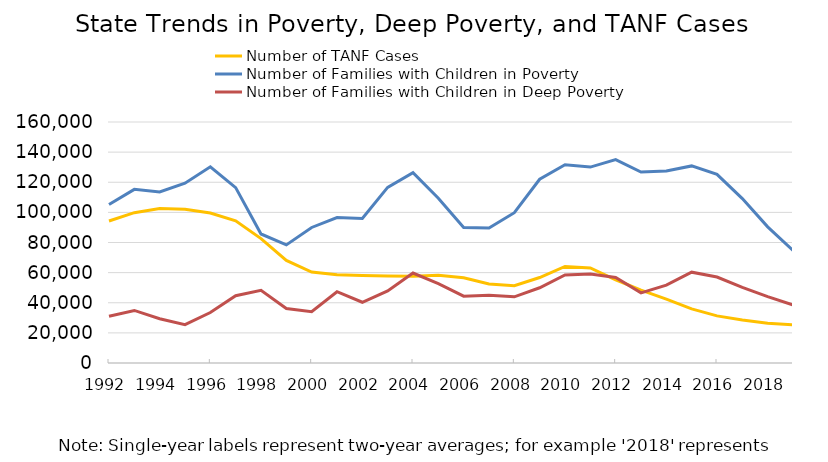
| Category | Number of TANF Cases | Number of Families with Children in Poverty | Number of Families with Children in Deep Poverty |
|---|---|---|---|
| 1992.0 | 94277.833 | 105231.5 | 31009.5 |
| 1993.0 | 99813.417 | 115269 | 34899.5 |
| 1994.0 | 102578.208 | 113508.5 | 29349.5 |
| 1995.0 | 102060.542 | 119355.5 | 25412.5 |
| 1996.0 | 99570.375 | 130292 | 33495 |
| 1997.0 | 94382.125 | 116445 | 44693 |
| 1998.0 | 82589.417 | 85643.5 | 48257.5 |
| 1999.0 | 68105.958 | 78406.5 | 36215 |
| 2000.0 | 60358.625 | 89980.5 | 34019 |
| 2001.0 | 58554.333 | 96550 | 47334.5 |
| 2002.0 | 58105.25 | 96002.5 | 40329.5 |
| 2003.0 | 57704.958 | 116624.5 | 47849 |
| 2004.0 | 57595 | 126390 | 59742 |
| 2005.0 | 58287.167 | 109422.5 | 52693 |
| 2006.0 | 56585.375 | 89953.5 | 44382.5 |
| 2007.0 | 52460.625 | 89593.5 | 45003.5 |
| 2008.0 | 51262.958 | 99766.5 | 43941.5 |
| 2009.0 | 56737.25 | 121982 | 49955 |
| 2010.0 | 64104.708 | 131671 | 58436.5 |
| 2011.0 | 63078.083 | 130060.5 | 59146 |
| 2012.0 | 55268.542 | 135046 | 56739 |
| 2013.0 | 48399 | 126741 | 46579.5 |
| 2014.0 | 42402.5 | 127420 | 51698.5 |
| 2015.0 | 35944.708 | 130844 | 60313.5 |
| 2016.0 | 31275.042 | 125217.5 | 57069.5 |
| 2017.0 | 28545.875 | 109145 | 50160 |
| 2018.0 | 26395.75 | 90394 | 44110 |
| 2019.0 | 25388.292 | 74678 | 38518 |